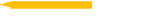
| Category | A first step in the automation journey |
|---|---|
| The cost is high | 3 |